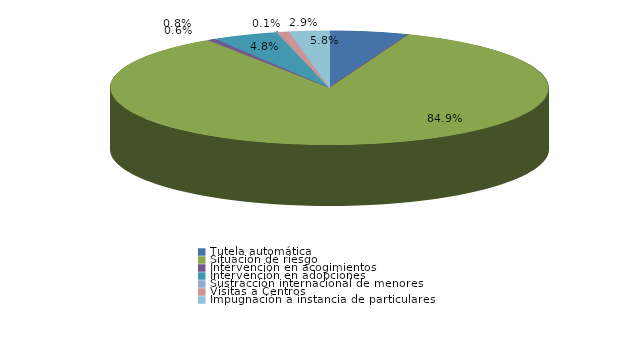
| Category | Series 0 |
|---|---|
| Tutela automática | 105 |
| Expedientes de Guarda | 0 |
| Situación de riesgo | 1526 |
| Intervención en acogimientos | 11 |
| Intervención en adopciones | 87 |
| Defensa de los derechos fundamentales | 0 |
| Sustracción internacional de menores | 2 |
| Visitas a Centros | 14 |
| Ensayos Clínicos | 0 |
| Impugnación a instacia del Fiscal | 0 |
| Impugnación a instancia de particulares | 53 |